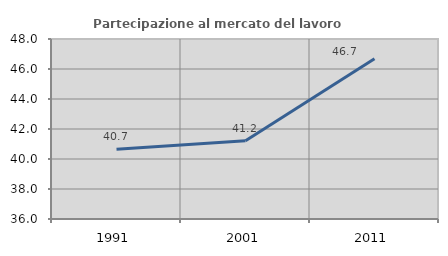
| Category | Partecipazione al mercato del lavoro  femminile |
|---|---|
| 1991.0 | 40.656 |
| 2001.0 | 41.216 |
| 2011.0 | 46.677 |